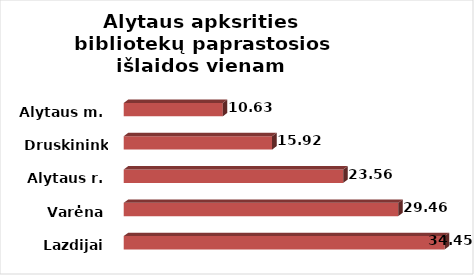
| Category | Series 0 |
|---|---|
| Lazdijai | 34.447 |
| Varėna | 29.461 |
| Alytaus r. | 23.561 |
| Druskininkai | 15.924 |
| Alytaus m. | 10.633 |